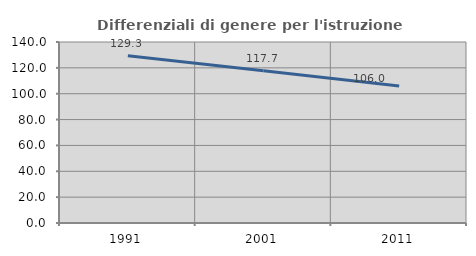
| Category | Differenziali di genere per l'istruzione superiore |
|---|---|
| 1991.0 | 129.327 |
| 2001.0 | 117.709 |
| 2011.0 | 106.04 |